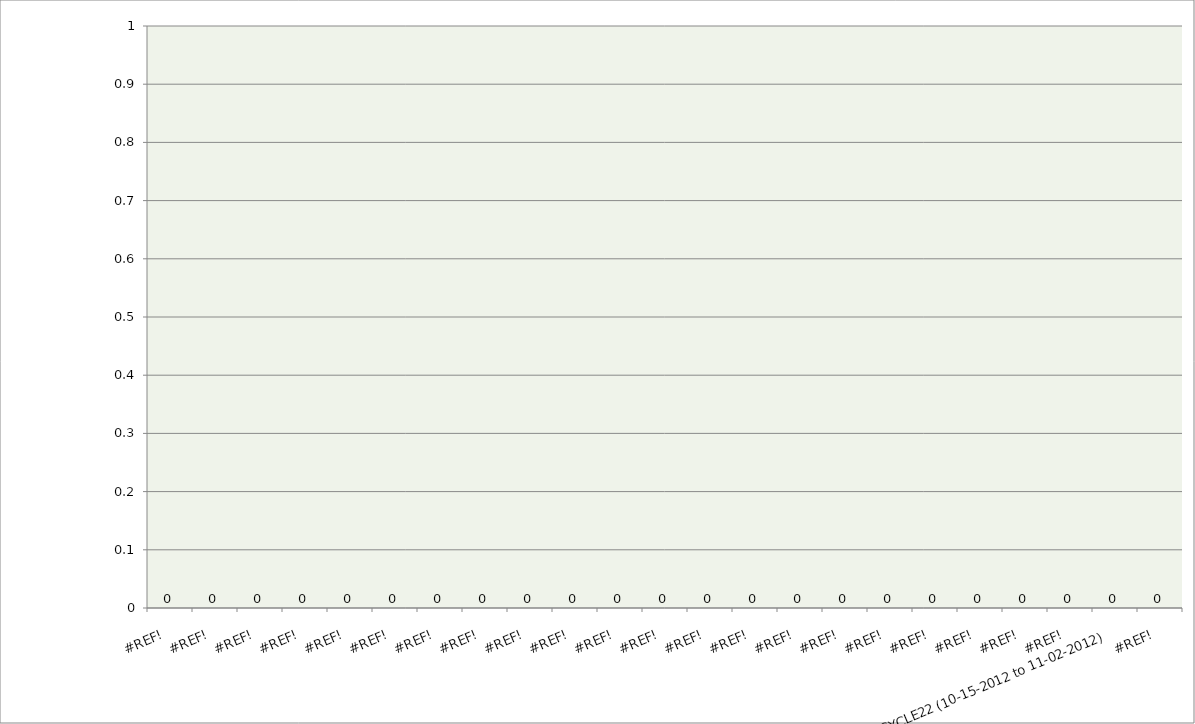
| Category | Series 0 |
|---|---|
| #REF! | 0 |
| #REF! | 0 |
| #REF! | 0 |
| #REF! | 0 |
| #REF! | 0 |
| #REF! | 0 |
| #REF! | 0 |
| #REF! | 0 |
| #REF! | 0 |
| #REF! | 0 |
| #REF! | 0 |
| #REF! | 0 |
| #REF! | 0 |
| #REF! | 0 |
| #REF! | 0 |
| #REF! | 0 |
| #REF! | 0 |
| #REF! | 0 |
| #REF! | 0 |
| #REF! | 0 |
| #REF! | 0 |
| CYCLE22 (10-15-2012 to 11-02-2012) | 0 |
| #REF! | 0 |